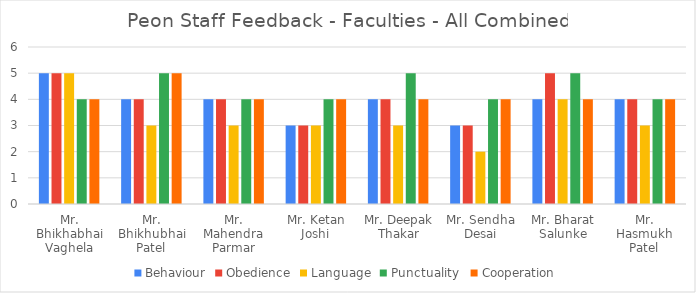
| Category | Behaviour | Obedience | Language | Punctuality  | Cooperation |
|---|---|---|---|---|---|
| Mr. Bhikhabhai Vaghela | 5 | 5 | 5 | 4 | 4 |
| Mr. Bhikhubhai Patel | 4 | 4 | 3 | 5 | 5 |
| Mr. Mahendra Parmar | 4 | 4 | 3 | 4 | 4 |
| Mr. Ketan Joshi | 3 | 3 | 3 | 4 | 4 |
| Mr. Deepak Thakar | 4 | 4 | 3 | 5 | 4 |
| Mr. Sendha Desai | 3 | 3 | 2 | 4 | 4 |
| Mr. Bharat Salunke | 4 | 5 | 4 | 5 | 4 |
| Mr. Hasmukh Patel | 4 | 4 | 3 | 4 | 4 |